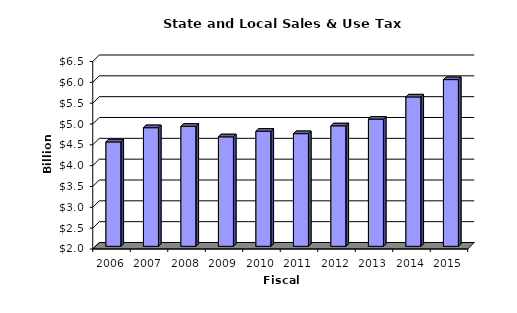
| Category | Series 0 |
|---|---|
| 2006.0 | 4.505 |
| 2007.0 | 4.847 |
| 2008.0 | 4.88 |
| 2009.0 | 4.628 |
| 2010.0 | 4.762 |
| 2011.0 | 4.704 |
| 2012.0 | 4.891 |
| 2013.0 | 5.052 |
| 2014.0 | 5.585 |
| 2015.0 | 6.001 |